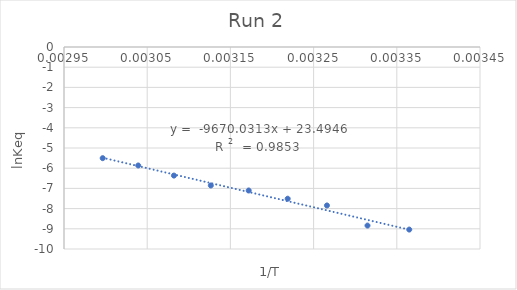
| Category | SIOEt repeat-1 |
|---|---|
| 0.003364963994885255 | -9.038 |
| 0.003314770617873243 | -8.84 |
| 0.0032660526487686982 | -7.845 |
| 0.0032188495831589788 | -7.511 |
| 0.003171985028230667 | -7.104 |
| 0.0031264655307175235 | -6.856 |
| 0.0030821390044691015 | -6.365 |
| 0.0030392365437802026 | -5.866 |
| 0.002996524032122737 | -5.504 |